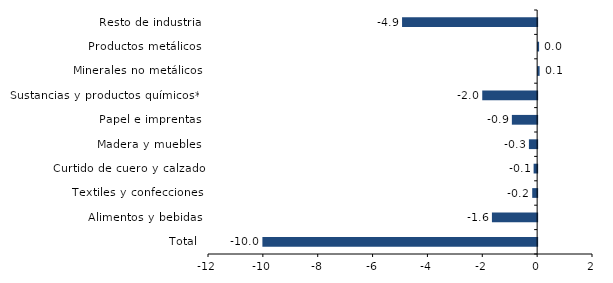
| Category | Series 0 |
|---|---|
| Total | -10.017 |
| Alimentos y bebidas | -1.649 |
| Textiles y confecciones | -0.18 |
| Curtido de cuero y calzado | -0.129 |
| Madera y muebles | -0.3 |
| Papel e imprentas | -0.922 |
| Sustancias y productos químicos** | -2.001 |
| Minerales no metálicos | 0.054 |
| Productos metálicos | 0.035 |
| Resto de industria | -4.925 |